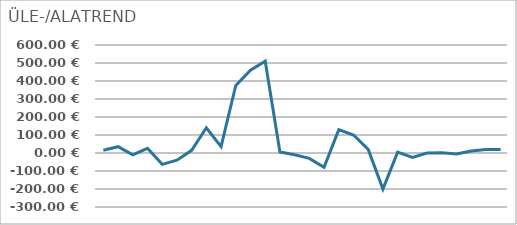
| Category | ERINEVUS |
|---|---|
| 0 | 15 |
| 1 | 35 |
| 2 | -10 |
| 3 | 26 |
| 4 | -63 |
| 5 | -40 |
| 6 | 15 |
| 7 | 140 |
| 8 | 35 |
| 9 | 375 |
| 10 | 460 |
| 11 | 510 |
| 12 | 6 |
| 13 | -10 |
| 14 | -30 |
| 15 | -80 |
| 16 | 130 |
| 17 | 100 |
| 18 | 20 |
| 19 | -200 |
| 20 | 5 |
| 21 | -25 |
| 22 | 0 |
| 23 | 1 |
| 24 | -5 |
| 25 | 11 |
| 26 | 20 |
| 27 | 20 |